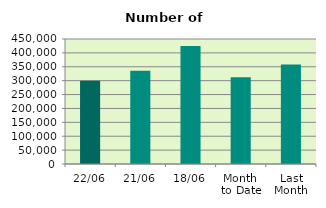
| Category | Series 0 |
|---|---|
| 22/06 | 299864 |
| 21/06 | 335764 |
| 18/06 | 424812 |
| Month 
to Date | 312555.625 |
| Last
Month | 357760.286 |